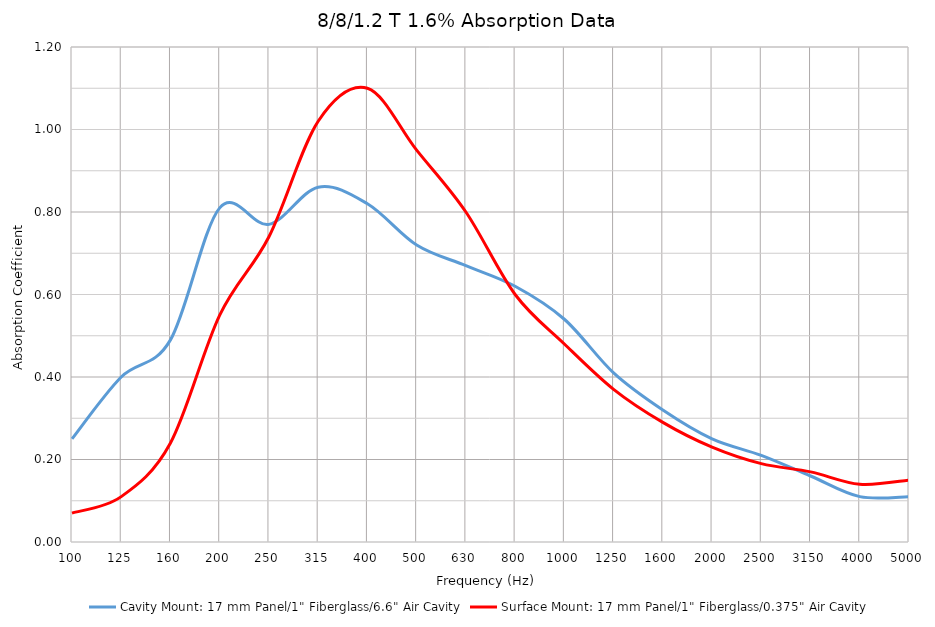
| Category | Cavity Mount: 17 mm Panel/1" Fiberglass/6.6" Air Cavity | Surface Mount: 17 mm Panel/1" Fiberglass/0.375" Air Cavity |
|---|---|---|
| 100.0 | 0.25 | 0.07 |
| 125.0 | 0.4 | 0.11 |
| 160.0 | 0.49 | 0.24 |
| 200.0 | 0.81 | 0.55 |
| 250.0 | 0.77 | 0.74 |
| 315.0 | 0.86 | 1.02 |
| 400.0 | 0.82 | 1.1 |
| 500.0 | 0.72 | 0.95 |
| 630.0 | 0.67 | 0.8 |
| 800.0 | 0.62 | 0.6 |
| 1000.0 | 0.54 | 0.48 |
| 1250.0 | 0.41 | 0.37 |
| 1600.0 | 0.32 | 0.29 |
| 2000.0 | 0.25 | 0.23 |
| 2500.0 | 0.21 | 0.19 |
| 3150.0 | 0.16 | 0.17 |
| 4000.0 | 0.11 | 0.14 |
| 5000.0 | 0.11 | 0.15 |